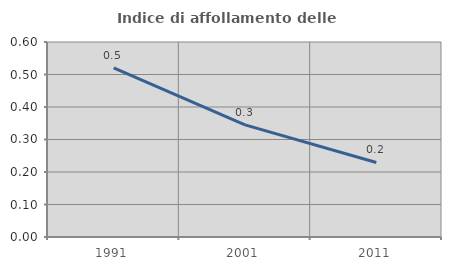
| Category | Indice di affollamento delle abitazioni  |
|---|---|
| 1991.0 | 0.52 |
| 2001.0 | 0.345 |
| 2011.0 | 0.229 |